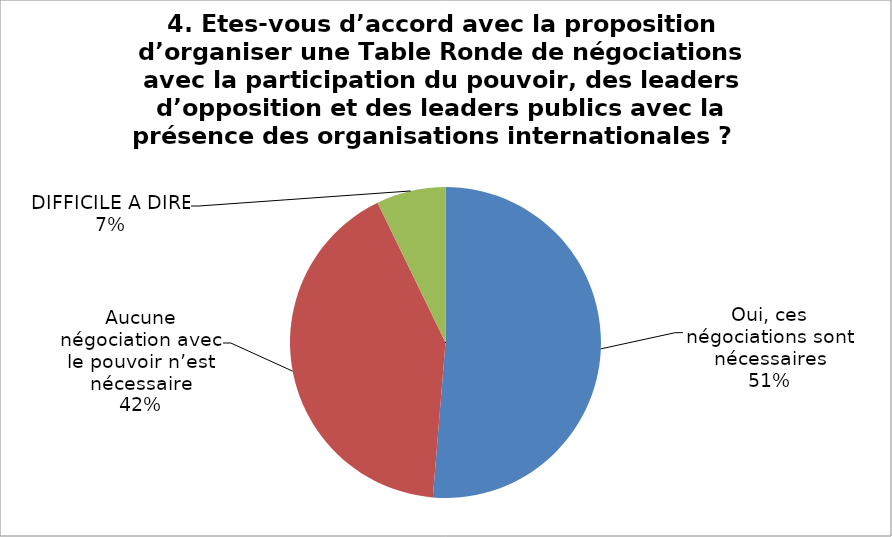
| Category | Series 0 |
|---|---|
| Oui, ces négociations sont nécessaires | 51.3 |
| Aucune négociation avec le pouvoir n’est nécessaire | 41.5 |
| DIFFICILE A DIRE | 7.2 |